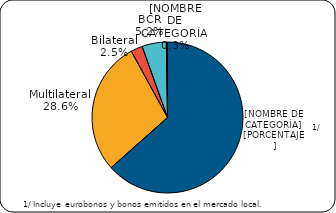
| Category | Series 0 |
|---|---|
| Inversionistas | 8567.2 |
| Multilateral | 3863.6 |
| Bilateral | 337.8 |
| BCR | 704.3 |
| Otros | 33.4 |